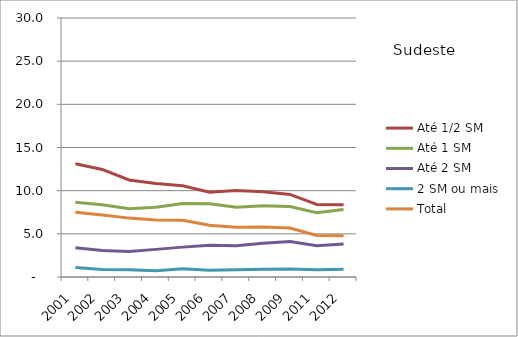
| Category | Até 1/2 SM | Até 1 SM | Até 2 SM | 2 SM ou mais | Total |
|---|---|---|---|---|---|
| 2001.0 | 13.11 | 8.67 | 3.4 | 1.09 | 7.51 |
| 2002.0 | 12.46 | 8.38 | 3.06 | 0.86 | 7.17 |
| 2003.0 | 11.24 | 7.91 | 2.95 | 0.85 | 6.82 |
| 2004.0 | 10.82 | 8.09 | 3.2 | 0.73 | 6.61 |
| 2005.0 | 10.57 | 8.52 | 3.46 | 0.95 | 6.57 |
| 2006.0 | 9.81 | 8.49 | 3.69 | 0.79 | 6 |
| 2007.0 | 10.01 | 8.07 | 3.61 | 0.84 | 5.76 |
| 2008.0 | 9.87 | 8.24 | 3.9 | 0.9 | 5.8 |
| 2009.0 | 9.56 | 8.16 | 4.12 | 0.93 | 5.67 |
| 2011.0 | 8.4 | 7.44 | 3.62 | 0.85 | 4.8 |
| 2012.0 | 8.36 | 7.83 | 3.83 | 0.89 | 4.79 |